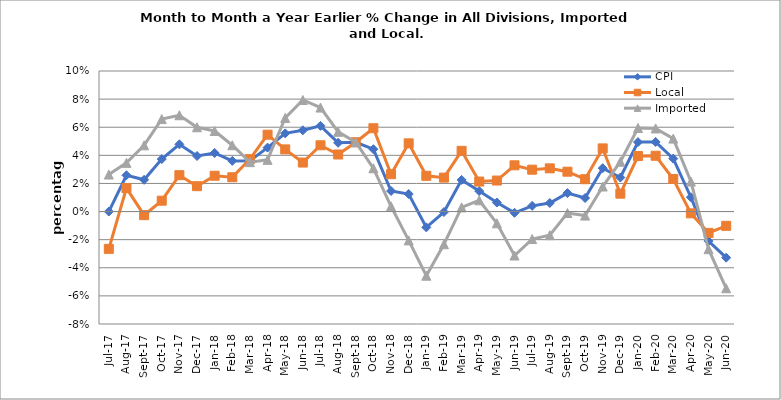
| Category | CPI | Local | Imported |
|---|---|---|---|
| 2017-07-01 | 0 | -0.027 | 0.026 |
| 2017-08-01 | 0.026 | 0.017 | 0.035 |
| 2017-09-01 | 0.023 | -0.003 | 0.047 |
| 2017-10-01 | 0.037 | 0.008 | 0.066 |
| 2017-11-01 | 0.048 | 0.026 | 0.069 |
| 2017-12-01 | 0.04 | 0.018 | 0.06 |
| 2018-01-01 | 0.042 | 0.025 | 0.057 |
| 2018-02-01 | 0.036 | 0.024 | 0.047 |
| 2018-03-01 | 0.036 | 0.037 | 0.035 |
| 2018-04-01 | 0.045 | 0.055 | 0.037 |
| 2018-05-01 | 0.056 | 0.044 | 0.067 |
| 2018-06-01 | 0.058 | 0.035 | 0.079 |
| 2018-07-01 | 0.061 | 0.047 | 0.074 |
| 2018-08-01 | 0.049 | 0.041 | 0.057 |
| 2018-09-01 | 0.049 | 0.049 | 0.049 |
| 2018-10-01 | 0.044 | 0.059 | 0.031 |
| 2018-11-01 | 0.015 | 0.027 | 0.004 |
| 2018-12-01 | 0.012 | 0.049 | -0.021 |
| 2019-01-01 | -0.011 | 0.025 | -0.046 |
| 2019-02-01 | 0 | 0.024 | -0.023 |
| 2019-03-01 | 0.023 | 0.043 | 0.003 |
| 2019-04-01 | 0.015 | 0.021 | 0.008 |
| 2019-05-01 | 0.006 | 0.022 | -0.008 |
| 2019-06-01 | -0.001 | 0.033 | -0.031 |
| 2019-07-01 | 0.004 | 0.03 | -0.02 |
| 2019-08-01 | 0.006 | 0.031 | -0.017 |
| 2019-09-01 | 0.013 | 0.028 | -0.001 |
| 2019-10-01 | 0.01 | 0.023 | -0.003 |
| 2019-11-01 | 0.031 | 0.045 | 0.018 |
| 2019-12-01 | 0.024 | 0.013 | 0.035 |
| 2020-01-01 | 0.049 | 0.039 | 0.059 |
| 2020-02-01 | 0.05 | 0.04 | 0.059 |
| 2020-03-01 | 0.038 | 0.023 | 0.052 |
| 2020-04-01 | 0.01 | -0.001 | 0.021 |
| 2020-05-01 | -0.021 | -0.015 | -0.027 |
| 2020-06-01 | -0.033 | -0.01 | -0.055 |